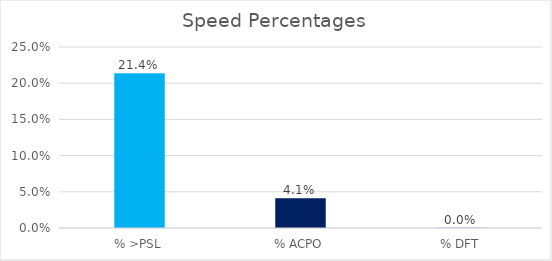
| Category | Series 0 |
|---|---|
| % >PSL | 0.214 |
| % ACPO | 0.041 |
| % DFT | 0 |